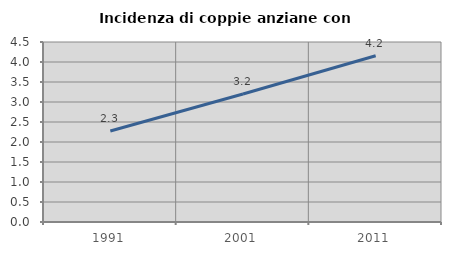
| Category | Incidenza di coppie anziane con figli |
|---|---|
| 1991.0 | 2.277 |
| 2001.0 | 3.201 |
| 2011.0 | 4.155 |